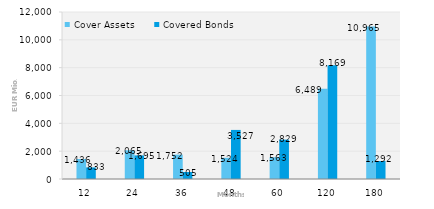
| Category | Cover Assets | Covered Bonds |
|---|---|---|
| 12.0 | 1436.388 | 833 |
| 24.0 | 2065.189 | 1694.5 |
| 36.0 | 1752.215 | 505 |
| 48.0 | 1524.16 | 3526.529 |
| 60.0 | 1562.657 | 2828.5 |
| 120.0 | 6488.628 | 8169.255 |
| 180.0 | 10964.668 | 1292 |